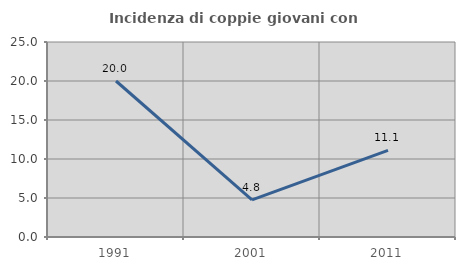
| Category | Incidenza di coppie giovani con figli |
|---|---|
| 1991.0 | 20 |
| 2001.0 | 4.762 |
| 2011.0 | 11.111 |